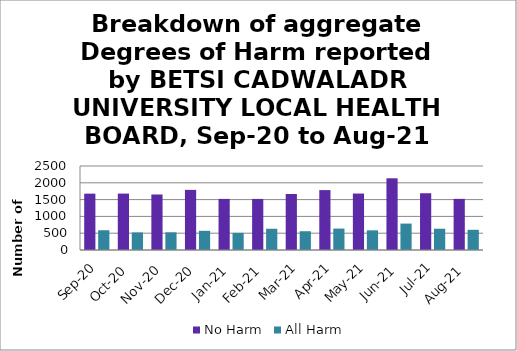
| Category | No Harm | All Harm |
|---|---|---|
| Sep-20 | 1677 | 588 |
| Oct-20 | 1679 | 523 |
| Nov-20 | 1652 | 526 |
| Dec-20 | 1789 | 571 |
| Jan-21 | 1521 | 509 |
| Feb-21 | 1520 | 632 |
| Mar-21 | 1667 | 559 |
| Apr-21 | 1783 | 637 |
| May-21 | 1680 | 585 |
| Jun-21 | 2134 | 786 |
| Jul-21 | 1689 | 633 |
| Aug-21 | 1522 | 601 |